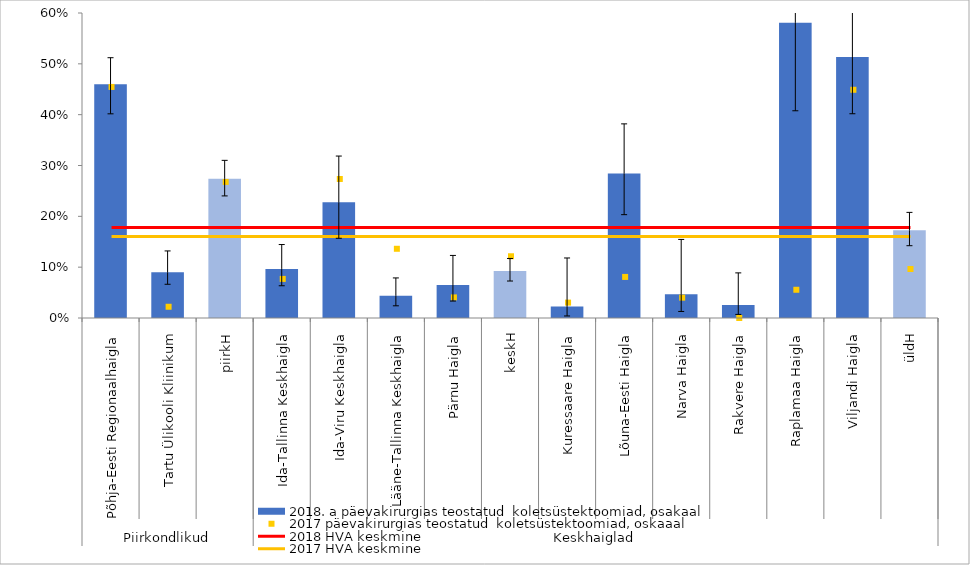
| Category | 2018. a päevakirurgias teostatud  koletsüstektoomiad, osakaal |
|---|---|
| 0 | 0.46 |
| 1 | 0.09 |
| 2 | 0.274 |
| 3 | 0.097 |
| 4 | 0.228 |
| 5 | 0.044 |
| 6 | 0.065 |
| 7 | 0.093 |
| 8 | 0.023 |
| 9 | 0.284 |
| 10 | 0.047 |
| 11 | 0.026 |
| 12 | 0.581 |
| 13 | 0.514 |
| 14 | 0.173 |